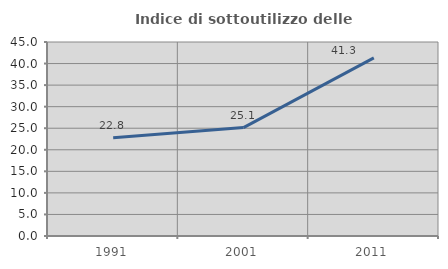
| Category | Indice di sottoutilizzo delle abitazioni  |
|---|---|
| 1991.0 | 22.792 |
| 2001.0 | 25.146 |
| 2011.0 | 41.304 |